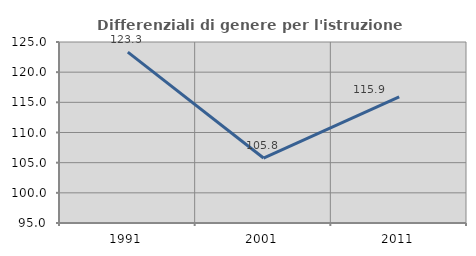
| Category | Differenziali di genere per l'istruzione superiore |
|---|---|
| 1991.0 | 123.311 |
| 2001.0 | 105.771 |
| 2011.0 | 115.913 |